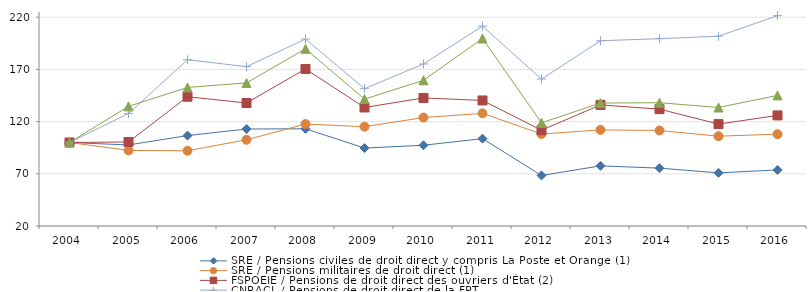
| Category | SRE / Pensions civiles de droit direct y compris La Poste et Orange (1) | SRE / Pensions militaires de droit direct (1) | FSPOEIE / Pensions de droit direct des ouvriers d'État (2) | CNRACL / Pensions de droit direct de la FPT | CNRACL / Pensions de droit direct de la FPH |
|---|---|---|---|---|---|
| 2004.0 | 100 | 100 | 100 | 100 | 100 |
| 2005.0 | 97.613 | 92.393 | 100.496 | 127.752 | 134.603 |
| 2006.0 | 106.628 | 92.08 | 143.833 | 179.252 | 152.734 |
| 2007.0 | 112.894 | 102.615 | 137.83 | 172.662 | 157.071 |
| 2008.0 | 113.129 | 117.658 | 170.43 | 199.075 | 189.712 |
| 2009.0 | 94.672 | 115.119 | 133.535 | 151.573 | 141.544 |
| 2010.0 | 97.35 | 123.882 | 142.676 | 175.23 | 159.573 |
| 2011.0 | 103.682 | 127.918 | 140.253 | 211.445 | 199.606 |
| 2012.0 | 68.421 | 108.138 | 111.729 | 160.742 | 118.873 |
| 2013.0 | 77.618 | 112.069 | 136.013 | 197.457 | 137.779 |
| 2014.0 | 75.422 | 111.501 | 131.938 | 199.465 | 138.102 |
| 2015.0 | 70.923 | 106.034 | 117.621 | 201.807 | 133.524 |
| 2016.0 | 73.715 | 107.967 | 125.936 | 221.485 | 145.094 |